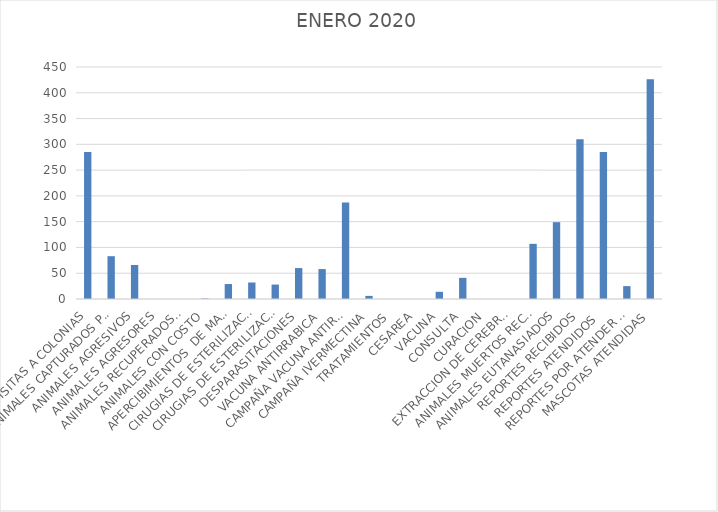
| Category | Series 0 |
|---|---|
| VISITAS A COLONIAS | 285 |
| ANIMALES CAPTURADOS PERROS Y GATOS  | 83 |
| ANIMALES AGRESIVOS | 66 |
| ANIMALES AGRESORES | 0 |
| ANIMALES RECUPERADOS POR SUS DUEÑOS | 0 |
| ANIMALES CON COSTO | 1 |
| APERCIBIMIENTOS  DE MALTRATO ANIMAL | 29 |
| CIRUGIAS DE ESTERILIZACION (OVH) hembra | 32 |
| CIRUGIAS DE ESTERILIZACION (ORQ) macho | 28 |
| DESPARASITACIONES | 60 |
| VACUNA ANTIRRABICA | 58 |
| CAMPAÑA VACUNA ANTIRRABICA | 187 |
| CAMPAÑA IVERMECTINA | 6 |
| TRATAMIENTOS | 0 |
| CESAREA | 0 |
| VACUNA | 14 |
| CONSULTA | 41 |
| CURACION | 0 |
| EXTRACCION DE CEREBROS | 0 |
| ANIMALES MUERTOS RECOLECTADOS | 107 |
| ANIMALES EUTANASIADOS | 149 |
| REPORTES RECIBIDOS | 310 |
| REPORTES ATENDIDOS  | 285 |
| REPORTES POR ATENDER (PENDIENTES) | 25 |
| MASCOTAS ATENDIDAS | 426 |